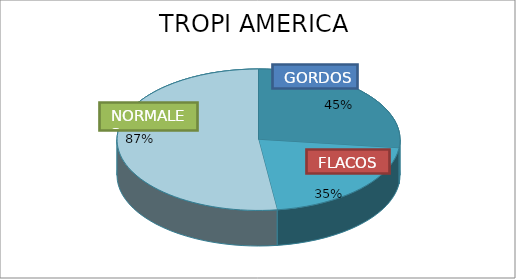
| Category | Series 0 | GORDO  FLACOS NORMALES  | Series 2 | Series 3 | Series 4 | Series 5 | Series 6 | Series 7 | Series 8 | Series 9 | Series 10 | Series 11 | Series 12 | Series 13 | Series 14 | Series 15 | Series 16 | Series 17 | Series 18 | Series 19 | Series 20 | Series 21 | Series 22 | Series 23 | Series 24 | Series 25 | Series 26 | Series 27 | Series 28 | Series 29 | Series 30 | Series 31 | Series 32 | Series 33 | Series 34 | Series 35 | Series 36 | Series 37 | Series 38 | Series 39 | Series 40 | Series 41 | Series 42 | Series 43 | Series 44 | Series 45 | Series 46 | Series 47 | Series 48 | Series 49 | Series 50 | Series 51 | Series 52 | Series 53 | Series 54 | Series 55 | Series 56 | Series 57 | Series 58 | Series 59 | Series 60 | Series 61 | Series 62 | Series 63 | Series 64 | Series 65 | Series 66 | Series 67 | Series 68 | Series 69 | Series 70 | Series 71 | Series 72 | Series 73 | Series 74 | Series 75 | Series 76 | Series 77 | Series 78 | Series 79 | Series 80 | Series 81 | Series 82 | Series 83 | Series 84 | Series 85 | Series 86 | Series 87 | Series 88 | Series 89 | Series 90 | Series 91 | Series 92 | Series 93 | Series 94 | Series 95 | Series 96 | Series 97 | Series 98 | Series 99 | Series 100 | Series 101 | Series 102 | Series 103 | Series 104 | Series 105 | Series 106 | Series 107 | Series 108 | Series 109 | Series 110 | Series 111 | Series 112 | Series 113 | Series 114 | Series 115 | Series 116 | Series 117 | Series 118 | Series 119 | Series 120 | Series 121 | Series 122 | Series 123 | Series 124 | Series 125 | Series 126 | Series 127 | Series 128 | Series 129 | Series 130 | Series 131 | Series 132 | Series 133 | Series 134 | Series 135 | Series 136 | Series 137 | Series 138 | Series 139 | Series 140 | Series 141 | Series 142 | Series 143 | Series 144 | Series 145 | Series 146 | Series 147 | Series 148 | Series 149 | Series 150 | Series 151 | Series 152 | Series 153 | Series 154 | Series 155 | Series 156 | Series 157 | Series 158 | Series 159 | Series 160 | Series 161 | Series 162 | Series 163 | Series 164 | Series 165 | Series 166 | Series 167 | Series 168 | Series 169 | Series 170 | Series 171 | Series 172 | Series 173 | Series 174 | Series 175 | Series 176 | Series 177 | Series 178 | Series 179 | Series 180 | Series 181 | Series 182 | Series 183 | Series 184 | Series 185 | Series 186 | Series 187 | Series 188 | Series 189 | Series 190 | Series 191 | Series 192 | Series 193 | Series 194 | Series 195 | Series 196 | Series 197 | Series 198 | Series 199 | Series 200 | Series 201 | Series 202 | Series 203 | Series 204 | Series 205 | Series 206 | Series 207 | Series 208 | Series 209 | Series 210 | Series 211 | Series 212 | Series 213 | Series 214 | Series 215 | Series 216 | Series 217 | Series 218 | Series 219 | Series 220 | Series 221 | Series 222 | Series 223 | Series 224 | Series 225 | Series 226 | Series 227 | Series 228 | Series 229 | Series 230 | Series 231 | Series 232 | Series 233 | Series 234 | Series 235 | Series 236 | Series 237 | Series 238 | Series 239 | Series 240 | Series 241 | Series 242 | Series 243 | Series 244 | Series 245 | Series 246 | Series 247 | Series 248 | Series 249 | Series 250 | Series 251 | Series 252 | Series 253 | Series 254 |
|---|---|---|---|---|---|---|---|---|---|---|---|---|---|---|---|---|---|---|---|---|---|---|---|---|---|---|---|---|---|---|---|---|---|---|---|---|---|---|---|---|---|---|---|---|---|---|---|---|---|---|---|---|---|---|---|---|---|---|---|---|---|---|---|---|---|---|---|---|---|---|---|---|---|---|---|---|---|---|---|---|---|---|---|---|---|---|---|---|---|---|---|---|---|---|---|---|---|---|---|---|---|---|---|---|---|---|---|---|---|---|---|---|---|---|---|---|---|---|---|---|---|---|---|---|---|---|---|---|---|---|---|---|---|---|---|---|---|---|---|---|---|---|---|---|---|---|---|---|---|---|---|---|---|---|---|---|---|---|---|---|---|---|---|---|---|---|---|---|---|---|---|---|---|---|---|---|---|---|---|---|---|---|---|---|---|---|---|---|---|---|---|---|---|---|---|---|---|---|---|---|---|---|---|---|---|---|---|---|---|---|---|---|---|---|---|---|---|---|---|---|---|---|---|---|---|---|---|---|---|---|---|---|---|---|---|---|---|---|---|---|---|---|---|---|---|---|---|---|---|---|---|---|---|---|---|
|  | 45 |  |  |  |  |  |  |  |  |  |  |  |  |  |  |  |  |  |  |  |  |  |  |  |  |  |  |  |  |  |  |  |  |  |  |  |  |  |  |  |  |  |  |  |  |  |  |  |  |  |  |  |  |  |  |  |  |  |  |  |  |  |  |  |  |  |  |  |  |  |  |  |  |  |  |  |  |  |  |  |  |  |  |  |  |  |  |  |  |  |  |  |  |  |  |  |  |  |  |  |  |  |  |  |  |  |  |  |  |  |  |  |  |  |  |  |  |  |  |  |  |  |  |  |  |  |  |  |  |  |  |  |  |  |  |  |  |  |  |  |  |  |  |  |  |  |  |  |  |  |  |  |  |  |  |  |  |  |  |  |  |  |  |  |  |  |  |  |  |  |  |  |  |  |  |  |  |  |  |  |  |  |  |  |  |  |  |  |  |  |  |  |  |  |  |  |  |  |  |  |  |  |  |  |  |  |  |  |  |  |  |  |  |  |  |  |  |  |  |  |  |  |  |  |  |  |  |  |  |  |  |  |  |  |  |  |  |  |  |  |  |  |  |  |  |  |  |  |  |  |  |  |  |  |  |